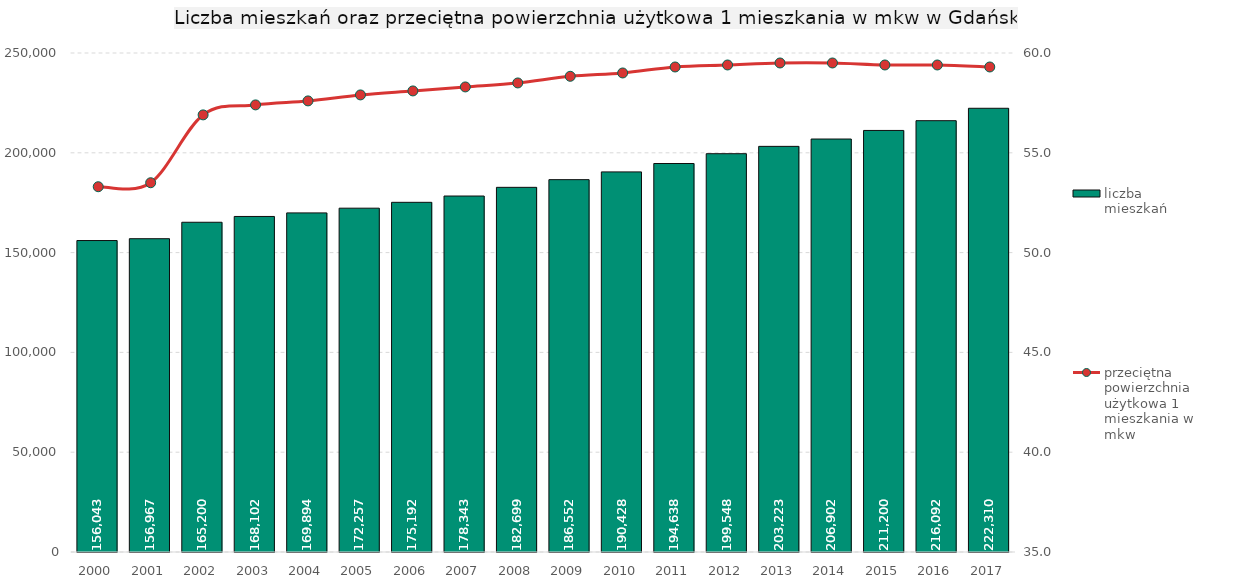
| Category | liczba mieszkań |
|---|---|
| 2000.0 | 156043 |
| 2001.0 | 156967 |
| 2002.0 | 165200 |
| 2003.0 | 168102 |
| 2004.0 | 169894 |
| 2005.0 | 172257 |
| 2006.0 | 175192 |
| 2007.0 | 178343 |
| 2008.0 | 182699 |
| 2009.0 | 186552 |
| 2010.0 | 190428 |
| 2011.0 | 194638 |
| 2012.0 | 199548 |
| 2013.0 | 203223 |
| 2014.0 | 206902 |
| 2015.0 | 211200 |
| 2016.0 | 216092 |
| 2017.0 | 222310 |